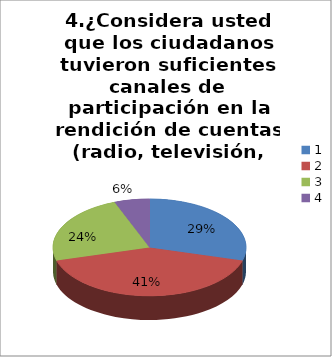
| Category | Series 0 |
|---|---|
| 0 | 10 |
| 1 | 14 |
| 2 | 8 |
| 3 | 2 |